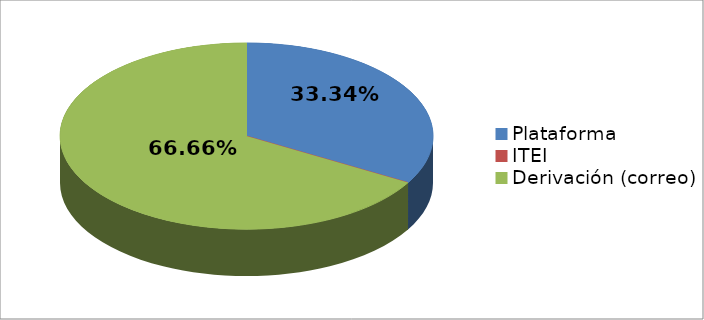
| Category | Series 0 | Series 1 |
|---|---|---|
| Plataforma | 1 | 0.333 |
| ITEI | 0 | 0 |
| Derivación (correo) | 2 | 0.667 |